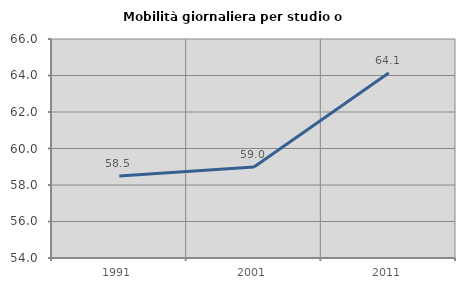
| Category | Mobilità giornaliera per studio o lavoro |
|---|---|
| 1991.0 | 58.495 |
| 2001.0 | 58.981 |
| 2011.0 | 64.141 |